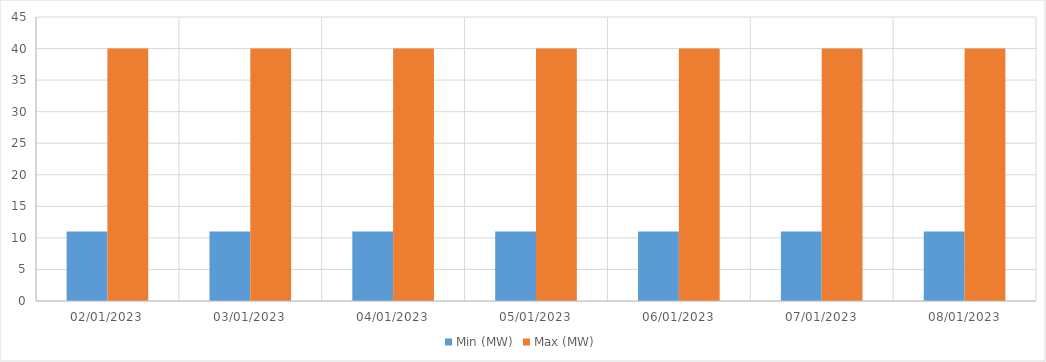
| Category | Min (MW) | Max (MW) |
|---|---|---|
| 02/01/2023 | 11 | 40 |
| 03/01/2023 | 11 | 40 |
| 04/01/2023 | 11 | 40 |
| 05/01/2023 | 11 | 40 |
| 06/01/2023 | 11 | 40 |
| 07/01/2023 | 11 | 40 |
| 08/01/2023 | 11 | 40 |